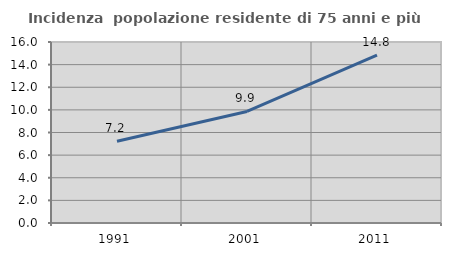
| Category | Incidenza  popolazione residente di 75 anni e più |
|---|---|
| 1991.0 | 7.23 |
| 2001.0 | 9.86 |
| 2011.0 | 14.844 |